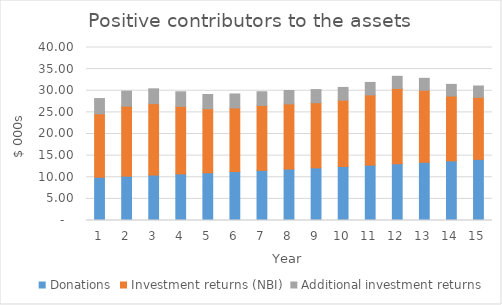
| Category | Donations | Investment returns (NBI) | Additional investment returns |
|---|---|---|---|
| 0 | 10 | 14.676 | 3.52 |
| 1 | 10.25 | 16.198 | 3.463 |
| 2 | 10.506 | 16.531 | 3.41 |
| 3 | 10.769 | 15.634 | 3.357 |
| 4 | 11.038 | 14.801 | 3.298 |
| 5 | 11.314 | 14.714 | 3.233 |
| 6 | 11.597 | 15.008 | 3.165 |
| 7 | 11.887 | 15.078 | 3.097 |
| 8 | 12.184 | 15.056 | 3.027 |
| 9 | 12.489 | 15.326 | 2.955 |
| 10 | 12.801 | 16.24 | 2.884 |
| 11 | 13.121 | 17.407 | 2.816 |
| 12 | 13.449 | 16.663 | 2.752 |
| 13 | 13.785 | 15.003 | 2.685 |
| 14 | 14.13 | 14.36 | 2.609 |